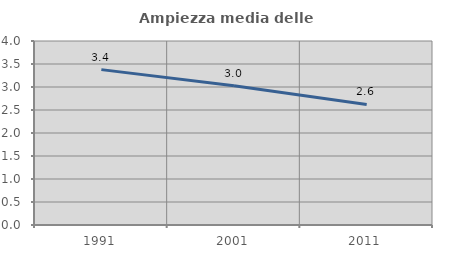
| Category | Ampiezza media delle famiglie |
|---|---|
| 1991.0 | 3.378 |
| 2001.0 | 3.029 |
| 2011.0 | 2.621 |